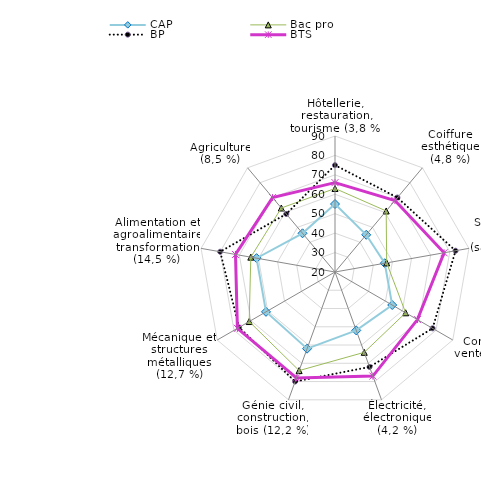
| Category | CAP | Bac pro | BP | BTS |
|---|---|---|---|---|
| Hôtellerie, restauration, tourisme (3,8 %) | 55 | 63 | 75 | 66 |
| Coiffure esthétique (4,8 %) | 45 | 61 | 70 | 68 |
| Services aux personnes (santé, social) (11,7 %) | 46 | 47 | 83 | 77 |
| Commerce, vente (12,2 %) | 54 | 62 | 78 | 69 |
| Électricité, électronique (4,2 %) | 52 | 64 | 72 | 77 |
| Génie civil, construction, bois (12,2 %) | 62 | 74 | 80 | 78 |
| Mécanique et structures métalliques (12,7 %) | 61 | 71 | 77 | 78 |
| Alimentation et agroalimentaire transformation (14,5 %) | 61 | 64 | 80 | 72 |
| Agriculture (8,5 %) | 46 | 63 | 59 | 70 |